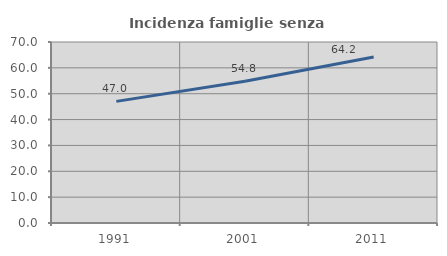
| Category | Incidenza famiglie senza nuclei |
|---|---|
| 1991.0 | 47.038 |
| 2001.0 | 54.783 |
| 2011.0 | 64.224 |